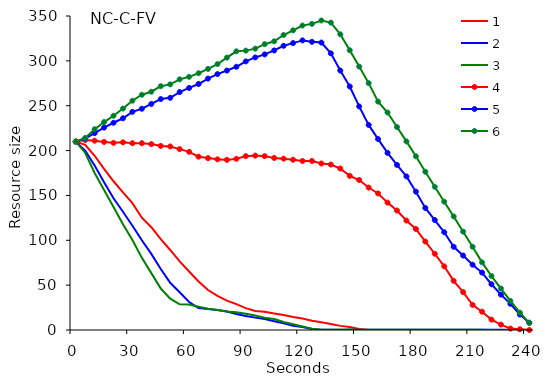
| Category | 1 | 2 | 3 | 4 | 5 | 6 |
|---|---|---|---|---|---|---|
| 0.0 | 210 | 210 | 210 | 210 | 210 | 210 |
| 5.0 | 206.4 | 199.8 | 197.6 | 211.8 | 213.4 | 214 |
| 10.0 | 194.2 | 183.4 | 175 | 211 | 219.4 | 223.8 |
| 15.0 | 179.6 | 164.8 | 156 | 209.6 | 225.6 | 231.8 |
| 20.0 | 165.8 | 146.8 | 137.2 | 208.6 | 231 | 238.8 |
| 25.0 | 153.4 | 131.8 | 117.8 | 209.2 | 236 | 246.8 |
| 30.0 | 141.4 | 116.2 | 100.4 | 208.2 | 243.2 | 255.6 |
| 35.0 | 125.2 | 100 | 80.4 | 208.2 | 246.6 | 262.2 |
| 40.0 | 114.6 | 84.8 | 63.4 | 207.2 | 252 | 265.6 |
| 45.0 | 101.2 | 68 | 46.2 | 205.2 | 257.4 | 271.8 |
| 50.0 | 89.2 | 52.6 | 35 | 204.6 | 258.8 | 273.8 |
| 55.0 | 76.4 | 42 | 28.6 | 201.6 | 265.2 | 279.4 |
| 60.0 | 65.2 | 31.2 | 28.4 | 198.6 | 269.8 | 282.2 |
| 65.0 | 54 | 24.4 | 26 | 193.2 | 274.2 | 286.2 |
| 70.0 | 44.6 | 23.4 | 23.6 | 191.6 | 280.2 | 291 |
| 75.0 | 38 | 22.2 | 22.2 | 190.2 | 285.2 | 296.4 |
| 80.0 | 32.8 | 20.6 | 20.6 | 189.6 | 289.2 | 303.6 |
| 85.0 | 28.8 | 17.8 | 19.8 | 190.8 | 293.4 | 310.6 |
| 90.0 | 24.4 | 15.6 | 18.2 | 193.8 | 299.4 | 311.4 |
| 95.0 | 21.2 | 13.8 | 16.2 | 194.4 | 303.8 | 313.6 |
| 100.0 | 20.4 | 12.2 | 13.6 | 193.8 | 307.2 | 318.6 |
| 105.0 | 18.4 | 9.8 | 12.2 | 191.8 | 311.6 | 321.8 |
| 110.0 | 16.6 | 7.4 | 9 | 191 | 316.8 | 328.8 |
| 115.0 | 14.4 | 4.8 | 6.4 | 189.8 | 319.8 | 334 |
| 120.0 | 12.8 | 3.2 | 4 | 188.4 | 322.8 | 339.4 |
| 125.0 | 10.4 | 1 | 1.4 | 188.4 | 321.2 | 341.2 |
| 130.0 | 8.6 | 0.4 | 0.4 | 185.6 | 320.4 | 345 |
| 135.0 | 6.8 | 0.4 | 0.4 | 184.4 | 308.4 | 342.6 |
| 140.0 | 4.6 | 0.4 | 0.4 | 180 | 289.2 | 329.6 |
| 145.0 | 3.4 | 0.4 | 0.6 | 171.8 | 271.4 | 311.8 |
| 150.0 | 1.2 | 0.4 | 0.2 | 167.2 | 249.2 | 293.6 |
| 155.0 | 0 | 0.4 | 0.2 | 158.8 | 228.6 | 275.2 |
| 160.0 | 0 | 0.4 | 0.2 | 152.2 | 212.8 | 254.6 |
| 165.0 | 0 | 0.4 | 0.2 | 142 | 197.4 | 242.4 |
| 170.0 | 0 | 0.2 | 0.2 | 133.2 | 184 | 226.2 |
| 175.0 | 0 | 0.2 | 0.2 | 122 | 171.2 | 210.2 |
| 180.0 | 0 | 0.2 | 0.2 | 112.6 | 154.2 | 193.6 |
| 185.0 | 0 | 0.2 | 0.2 | 98.6 | 136 | 176.4 |
| 190.0 | 0 | 0.2 | 0.2 | 85 | 122.6 | 159.6 |
| 195.0 | 0 | 0.2 | 0.2 | 71 | 109 | 143 |
| 200.0 | 0 | 0.2 | 0.2 | 54.8 | 92.8 | 126.6 |
| 205.0 | 0 | 0.2 | 0.2 | 42.2 | 83 | 109.6 |
| 210.0 | 0 | 0.2 | 0.2 | 28 | 72.8 | 92.8 |
| 215.0 | 0 | 0.2 | 0.2 | 20.4 | 64 | 75.4 |
| 220.0 | 0 | 0.2 | 0 | 11.6 | 51 | 60.2 |
| 225.0 | 0 | 0.2 | 0 | 6 | 39.4 | 46.2 |
| 230.0 | 0 | 0.2 | 0 | 1.6 | 29.2 | 32.4 |
| 235.0 | 0 | 0.2 | 0 | 0.8 | 17.2 | 19.4 |
| 240.0 | 0 | 0 | 0 | 0 | 8.2 | 7.8 |